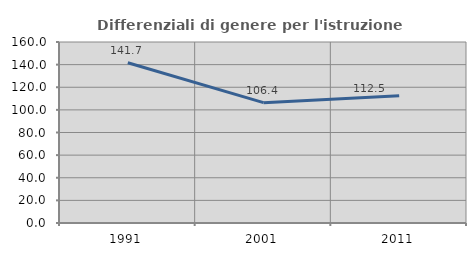
| Category | Differenziali di genere per l'istruzione superiore |
|---|---|
| 1991.0 | 141.7 |
| 2001.0 | 106.36 |
| 2011.0 | 112.519 |